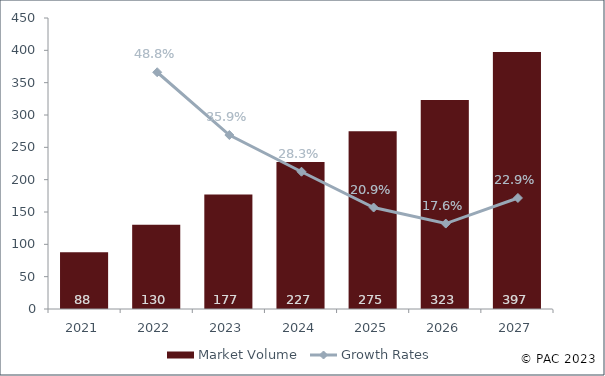
| Category | Market Volume |
|---|---|
| 2021.0 | 87.645 |
| 2022.0 | 130.429 |
| 2023.0 | 177.217 |
| 2024.0 | 227.377 |
| 2025.0 | 274.951 |
| 2026.0 | 323.386 |
| 2027.0 | 397.42 |